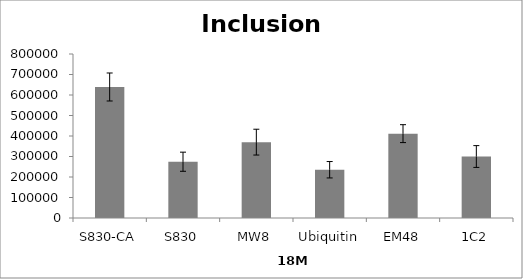
| Category | Series 0 |
|---|---|
| S830-CA | 639032.042 |
| S830 | 274511.31 |
| MW8 | 370060.198 |
| Ubiquitin | 235407.332 |
| EM48 | 411492.563 |
| 1C2 | 299919.492 |